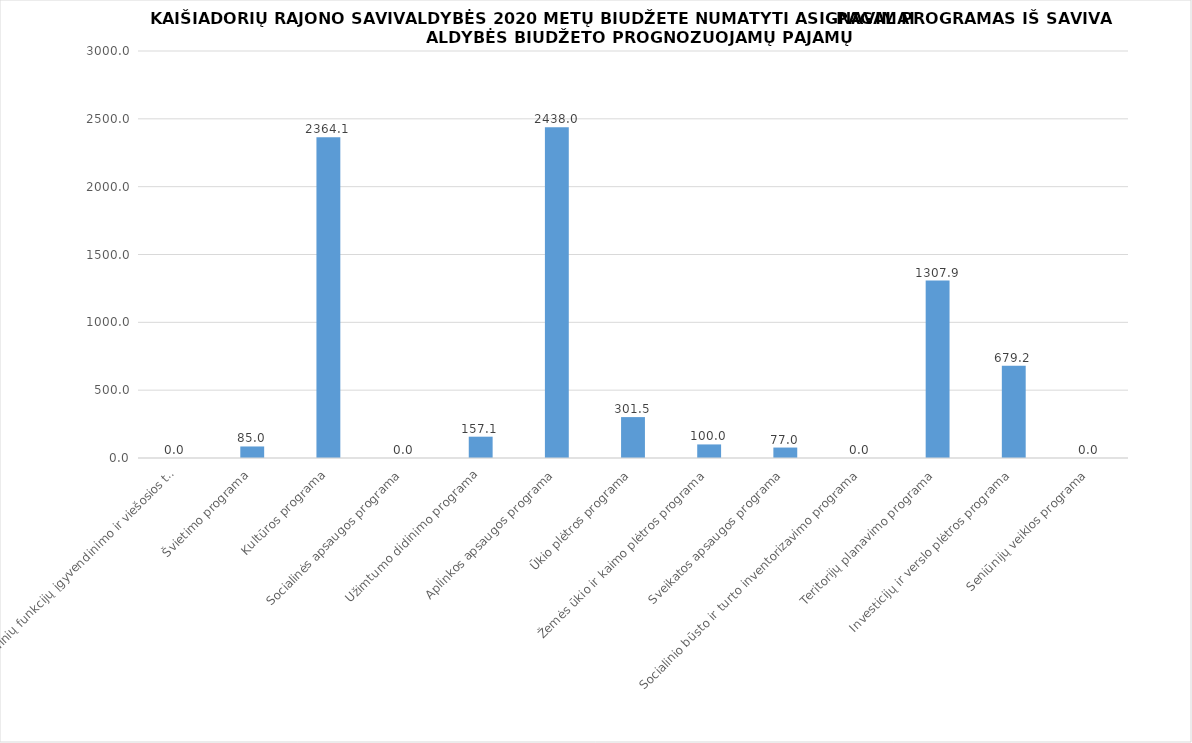
| Category | Series 0 |
|---|---|
| Savivaldybės pagrindinių funkcijų įgyvendinimo ir viešosios tvarkos užtikrinimo programa | 0 |
| Švietimo programa | 85 |
| Kultūros programa | 2364.1 |
| Socialinės apsaugos programa | 0 |
| Užimtumo didinimo programa | 157.1 |
| Aplinkos apsaugos programa | 2438 |
| Ūkio plėtros programa | 301.5 |
| Žemės ūkio ir kaimo plėtros programa | 100 |
| Sveikatos apsaugos programa | 77 |
| Socialinio būsto ir turto inventorizavimo programa | 0 |
| Teritorijų planavimo programa | 1307.9 |
| Investicijų ir verslo plėtros programa | 679.2 |
| Seniūnijų veiklos programa | 0 |